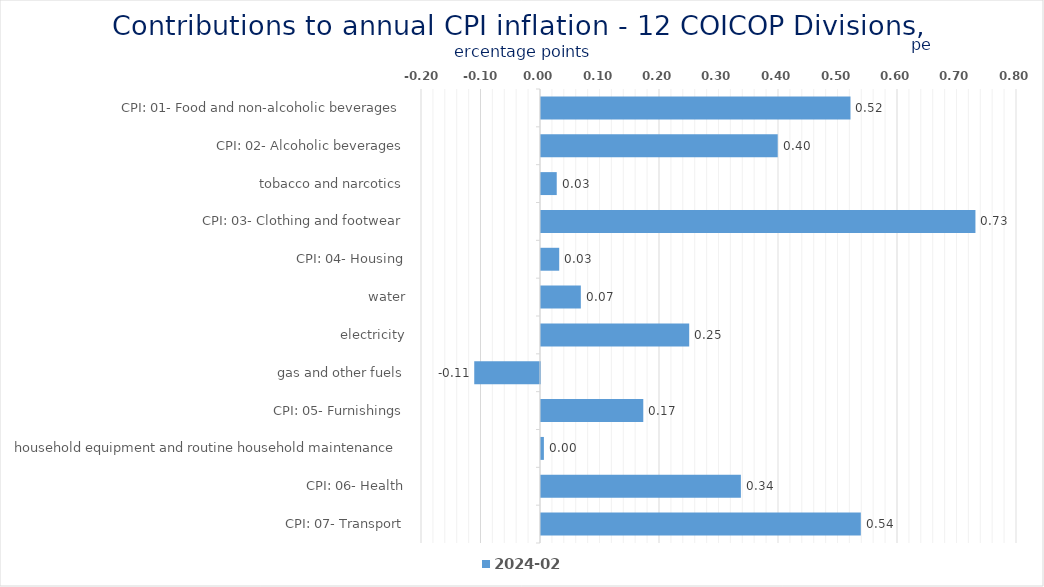
| Category | 2024-02 |
|---|---|
| CPI: 01- Food and non-alcoholic beverages | 0.52 |
| CPI: 02- Alcoholic beverages, tobacco and narcotics | 0.398 |
| CPI: 03- Clothing and footwear | 0.026 |
| CPI: 04- Housing, water, electricity, gas and other fuels | 0.73 |
| CPI: 05- Furnishings, household equipment and routine household maintenance | 0.031 |
| CPI: 06- Health | 0.067 |
| CPI: 07- Transport | 0.249 |
| CPI: 08- Communication | -0.111 |
| CPI: 09- Recreation and culture | 0.172 |
| CPI: 10- Education | 0.005 |
| CPI: 11- Restaurants and hotels | 0.336 |
| CPI: 12- Miscellaneous goods and services | 0.538 |